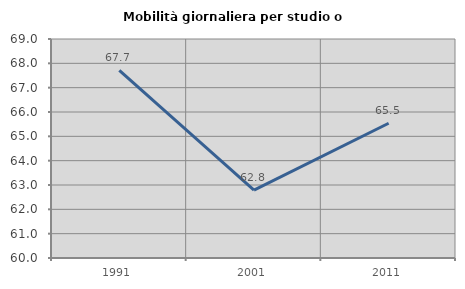
| Category | Mobilità giornaliera per studio o lavoro |
|---|---|
| 1991.0 | 67.709 |
| 2001.0 | 62.791 |
| 2011.0 | 65.538 |